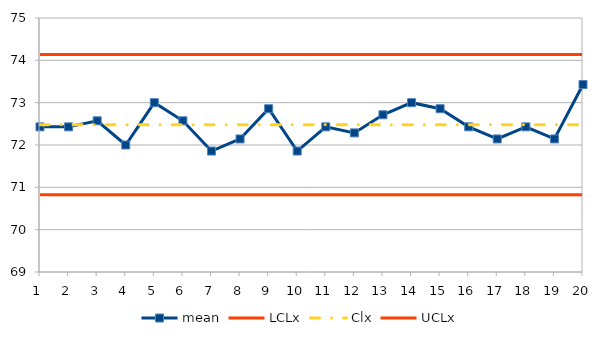
| Category | mean | LCLx | Clx | UCLx |
|---|---|---|---|---|
| 0 | 72.429 | 70.822 | 72.479 | 74.135 |
| 1 | 72.429 | 70.822 | 72.479 | 74.135 |
| 2 | 72.571 | 70.822 | 72.479 | 74.135 |
| 3 | 72 | 70.822 | 72.479 | 74.135 |
| 4 | 73 | 70.822 | 72.479 | 74.135 |
| 5 | 72.571 | 70.822 | 72.479 | 74.135 |
| 6 | 71.857 | 70.822 | 72.479 | 74.135 |
| 7 | 72.143 | 70.822 | 72.479 | 74.135 |
| 8 | 72.857 | 70.822 | 72.479 | 74.135 |
| 9 | 71.857 | 70.822 | 72.479 | 74.135 |
| 10 | 72.429 | 70.822 | 72.479 | 74.135 |
| 11 | 72.286 | 70.822 | 72.479 | 74.135 |
| 12 | 72.714 | 70.822 | 72.479 | 74.135 |
| 13 | 73 | 70.822 | 72.479 | 74.135 |
| 14 | 72.857 | 70.822 | 72.479 | 74.135 |
| 15 | 72.429 | 70.822 | 72.479 | 74.135 |
| 16 | 72.143 | 70.822 | 72.479 | 74.135 |
| 17 | 72.429 | 70.822 | 72.479 | 74.135 |
| 18 | 72.143 | 70.822 | 72.479 | 74.135 |
| 19 | 73.429 | 70.822 | 72.479 | 74.135 |